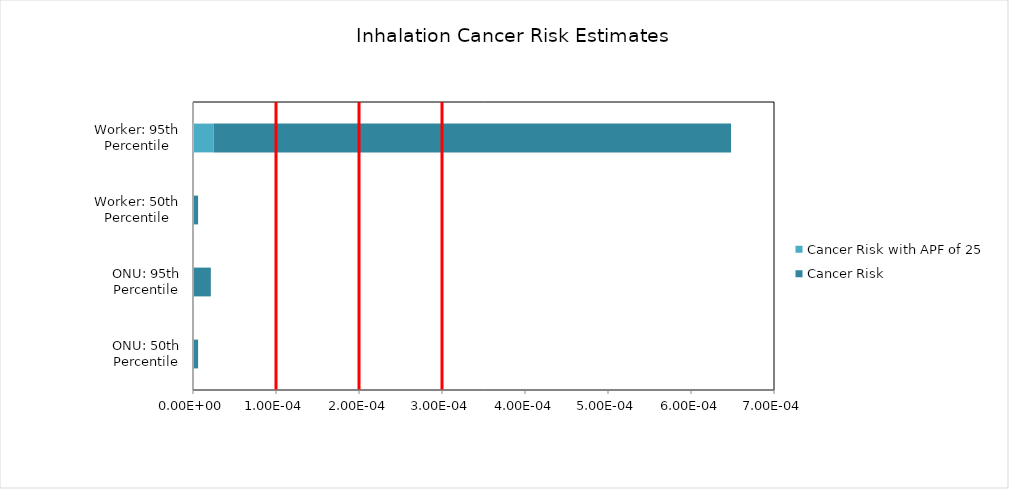
| Category | Cancer Risk with APF of 25 | Cancer Risk |
|---|---|---|
| ONU: 50th Percentile | 0 | 0 |
| ONU: 95th Percentile | 0 | 0 |
| Worker: 50th Percentile | 0 | 0 |
| Worker: 95th Percentile | 0 | 0.001 |